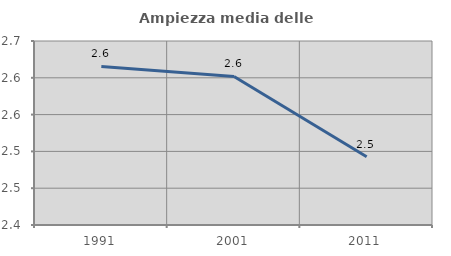
| Category | Ampiezza media delle famiglie |
|---|---|
| 1991.0 | 2.615 |
| 2001.0 | 2.602 |
| 2011.0 | 2.493 |